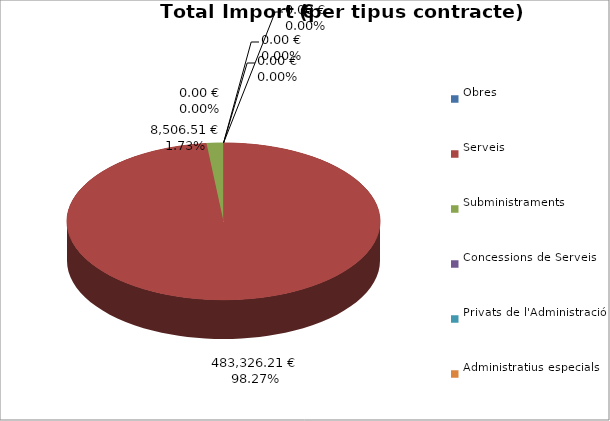
| Category | Total preu
(amb IVA) |
|---|---|
| Obres | 0 |
| Serveis | 483326.21 |
| Subministraments | 8506.51 |
| Concessions de Serveis | 0 |
| Privats de l'Administració | 0 |
| Administratius especials | 0 |